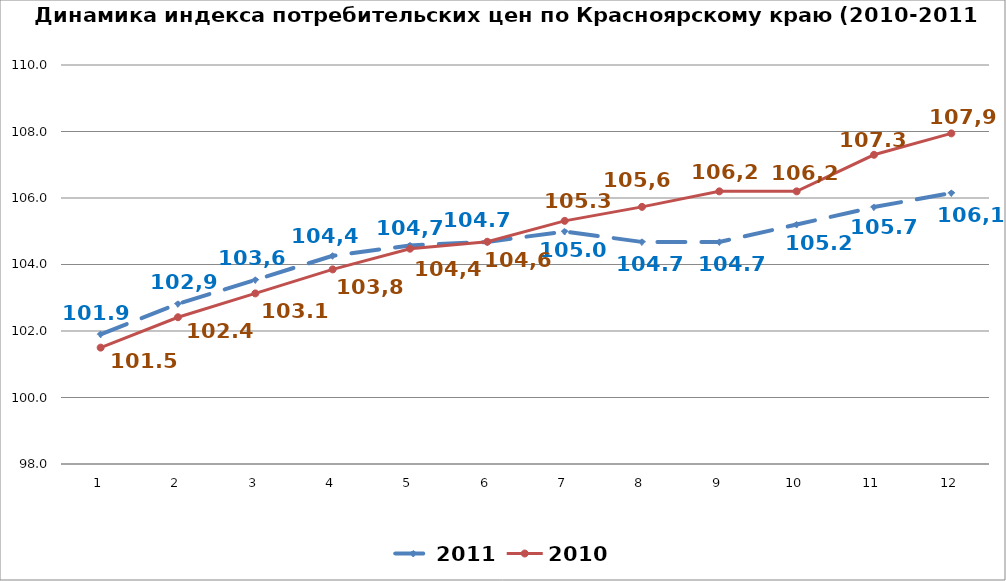
| Category | 2011 | 2010 |
|---|---|---|
| 0 | 101.9 | 101.5 |
| 1 | 102.817 | 102.414 |
| 2 | 103.537 | 103.13 |
| 3 | 104.262 | 103.852 |
| 4 | 104.574 | 104.475 |
| 5 | 104.679 | 104.684 |
| 6 | 104.993 | 105.312 |
| 7 | 104.678 | 105.734 |
| 8 | 104.678 | 106.2 |
| 9 | 105.201 | 106.2 |
| 10 | 105.727 | 107.3 |
| 11 | 106.15 | 107.944 |